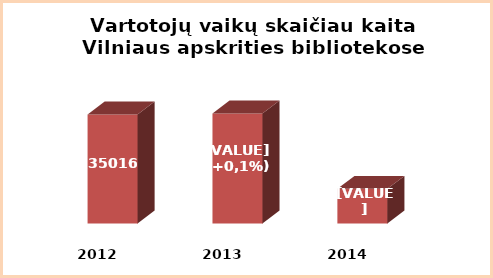
| Category | Series 0 |
|---|---|
| 2012.0 | 35016 |
| 2013.0 | 35057 |
| 2014.0 | 32277 |